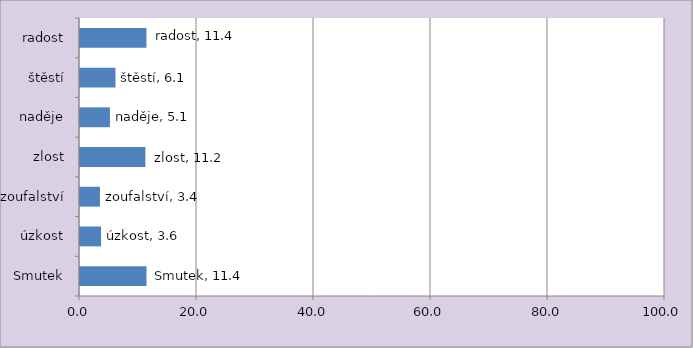
| Category | Series 0 |
|---|---|
| Smutek | 11.364 |
| úzkost | 3.598 |
| zoufalství | 3.409 |
| zlost | 11.174 |
| naděje | 5.114 |
| štěstí | 6.061 |
| radost | 11.364 |